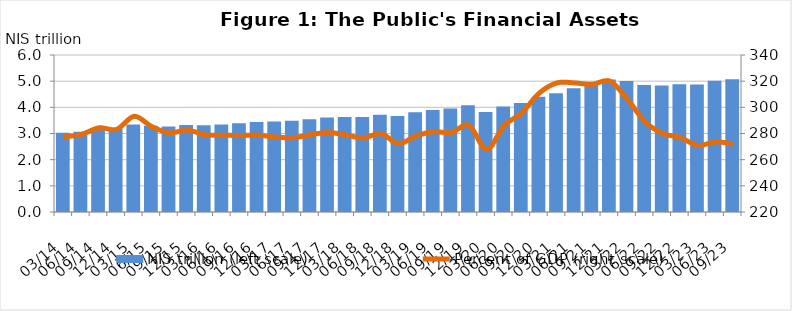
| Category | NIS trillion (left scale) |
|---|---|
| 2014-03-31 | 3030.51 |
| 2014-06-30 | 3068.32 |
| 2014-09-30 | 3150.23 |
| 2014-12-31 | 3182.07 |
| 2015-03-31 | 3341.02 |
| 2015-06-30 | 3295.9 |
| 2015-09-30 | 3269.99 |
| 2015-12-31 | 3325.83 |
| 2016-03-31 | 3312.83 |
| 2016-06-30 | 3339.68 |
| 2016-09-30 | 3395.51 |
| 2016-12-31 | 3436.6 |
| 2017-03-31 | 3454.91 |
| 2017-06-30 | 3488.08 |
| 2017-09-30 | 3544.53 |
| 2017-12-31 | 3610.36 |
| 2018-03-31 | 3627.61 |
| 2018-06-30 | 3634.49 |
| 2018-09-30 | 3717.59 |
| 2018-12-31 | 3667.07 |
| 2019-03-31 | 3807.85 |
| 2019-06-30 | 3898.88 |
| 2019-09-30 | 3955.55 |
| 2019-12-31 | 4077.77 |
| 2020-03-31 | 3826.15 |
| 2020-06-30 | 4028.67 |
| 2020-09-30 | 4163.95 |
| 2020-12-31 | 4407.75 |
| 2021-03-31 | 4537.98 |
| 2021-06-30 | 4733.62 |
| 2021-09-30 | 4840.12 |
| 2021-12-31 | 5062.41 |
| 2022-03-31 | 5010.19 |
| 2022-06-30 | 4853.09 |
| 2022-09-30 | 4836.72 |
| 2022-12-31 | 4884.06 |
| 2023-03-31 | 4875.23 |
| 2023-06-30 | 5012.67 |
| 2023-09-30 | 5071.71 |